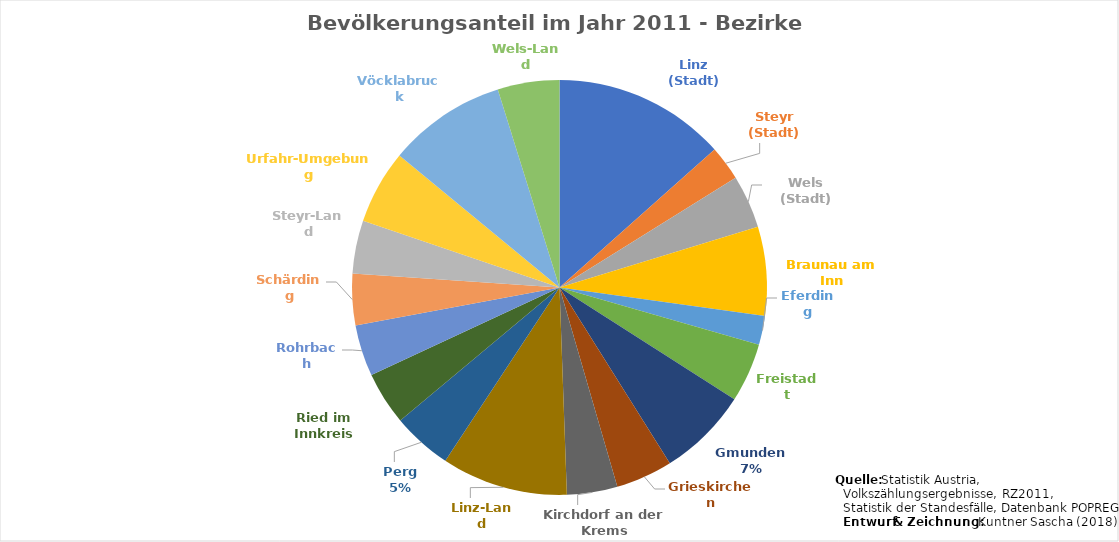
| Category | Series 0 |
|---|---|
| Linz (Stadt) | 189889 |
| Steyr (Stadt) | 38205 |
| Wels (Stadt) | 58591 |
| Braunau am Inn | 97826 |
| Eferding | 31741 |
| Freistadt | 65113 |
| Gmunden | 99403 |
| Grieskirchen | 62555 |
| Kirchdorf an der Krems | 55557 |
| Linz-Land | 139116 |
| Perg | 65738 |
| Ried im Innkreis | 58553 |
| Rohrbach | 56688 |
| Schärding | 56426 |
| Steyr-Land | 58700 |
| Urfahr-Umgebung | 81400 |
| Vöcklabruck | 130316 |
| Wels-Land | 67945 |